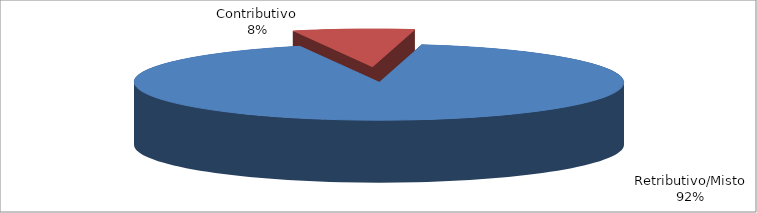
| Category | Series 1 |
|---|---|
| Retributivo/Misto | 19779 |
| Contributivo | 1725 |